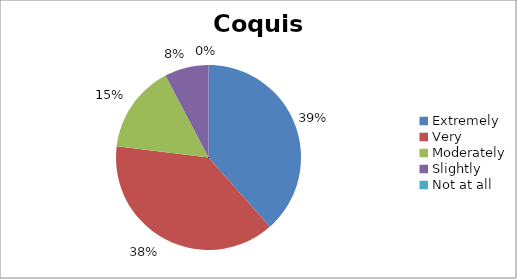
| Category | Coquis |
|---|---|
| Extremely | 5 |
| Very | 5 |
| Moderately | 2 |
| Slightly | 1 |
| Not at all | 0 |